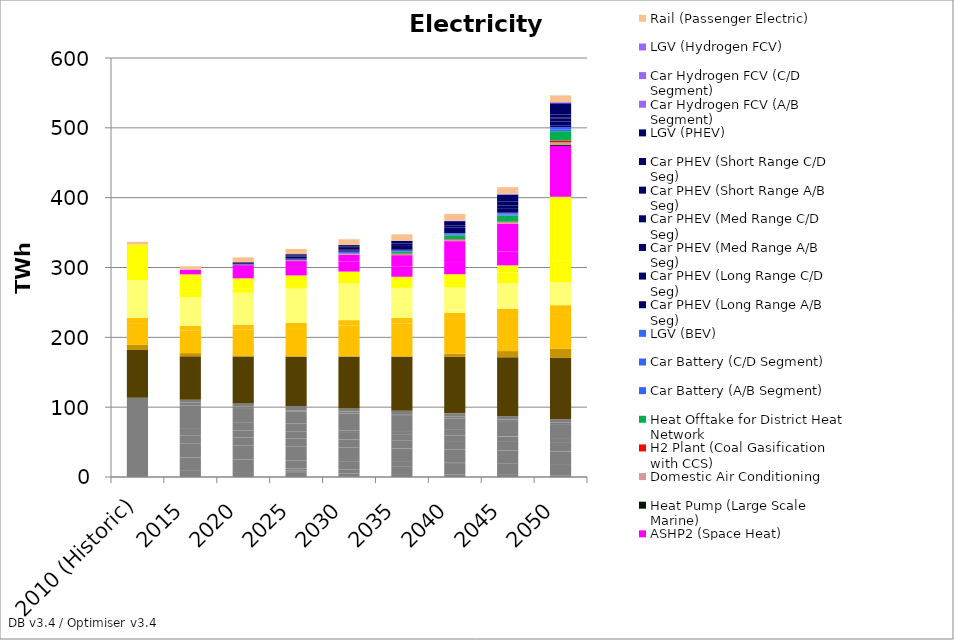
| Category | I1 Industry (Iron, Steel, Metals) | I1a Industry + CCS (Iron, Steel, Metals) | I1g Industry + hydrogen (Iron, Steel, Metals) | I2b Industry + Bio (Chemicals) | I2c Industry + Bio + CCS (Chemicals) | I2e Industry + Gas (Chemicals) | I2f Industry + Gas + CCS (Chemicals) | I2g Industry + hydrogen (Chemicals) | I3 Industry (Metal Products) | I4 Industry (Food, drinks, tobacco) | I5 Industry (Paper, printing, publishing) | I6 Industry (Other) | I6b Industry + Bio (Other) | I6c Industry + Bio + CCS (Other) | I6g Industry + hydrogen (Other) | I7b Industry + Bio (Refining) | I7c Industry + Bio + CCS (Refining) | I7e Industry + Gas (Refining) | I7f Industry + Gas + CCS (Refining) | I7g Industry + hydrogen (Refining) | I8 Industry (Agriculture) | Industry Sector | Domestic Appliances | Domestic Cooking (Electric) | Floorspace (Commercial) | Floorspace (Public) | Lighting (CFL) | Lighting (Incandescent) | Lighting (LED) | Electric Resistive Heating | Electric Resistive Heating - Hot Water | Electric Resistive Heating - Space Heat | ASHP2 (Hot Water) | ASHP2 (Space Heat) | Heat Pump (Large Scale Marine) | Domestic Air Conditioning | H2 Plant (Coal Gasification with CCS) | Heat Offtake for District Heat Network | Car Battery (A/B Segment) | Car Battery (C/D Segment) | LGV (BEV) | Car PHEV (Long Range A/B Seg) | Car PHEV (Long Range C/D Seg) | Car PHEV (Med Range A/B Seg) | Car PHEV (Med Range C/D Seg) | Car PHEV (Short Range A/B Seg) | Car PHEV (Short Range C/D Seg) | LGV (PHEV) | Car Hydrogen FCV (A/B Segment) | Car Hydrogen FCV (C/D Segment) | LGV (Hydrogen FCV) | Rail (Passenger Electric) |
|---|---|---|---|---|---|---|---|---|---|---|---|---|---|---|---|---|---|---|---|---|---|---|---|---|---|---|---|---|---|---|---|---|---|---|---|---|---|---|---|---|---|---|---|---|---|---|---|---|---|---|---|---|
| 2010 (Historic) | 0 | 0 | 0 | 0 | 0 | 0 | 0 | 0 | 0 | 0 | 0 | 0 | 0 | 0 | 0 | 0 | 0 | 0 | 0 | 0 | 0 | 113.5 | 68.4 | 7.3 | 31.2 | 7.4 | 34.3 | 19.8 | 0 | 51 | 0 | 0 | 0 | 0 | 0 | 0 | 0 | 0 | 0 | 0 | 0 | 0 | 0 | 0 | 0 | 0 | 0 | 0 | 0 | 0 | 0 | 3.9 |
| 2015 | 9.866 | 0 | 0 | 0 | 0 | 18.058 | 0 | 0 | 19.678 | 11.492 | 10.968 | 31.859 | 0 | 0 | 0 | 0.92 | 0 | 3.845 | 0 | 0 | 3.986 | 0 | 62.099 | 4.638 | 32.426 | 6.718 | 40.999 | 0 | 0.046 | 0 | 8.46 | 24.115 | 0 | 6.279 | 0 | 0.385 | 0 | 0 | 0 | 0 | 0 | 0.009 | 0.012 | 0.008 | 0.009 | 0.005 | 0.006 | 0.222 | 0 | 0 | 0 | 4.601 |
| 2020 | 7.115 | 0 | 0 | 0 | 0 | 18.134 | 0 | 0 | 19.564 | 11.559 | 10.426 | 10.786 | 19.858 | 0 | 0 | 3.494 | 0 | 0.295 | 0 | 0 | 4.111 | 0 | 66.74 | 2.061 | 37.019 | 7.058 | 45.488 | 0 | 0 | 0 | 5.899 | 14.895 | 10.462 | 8.489 | 0 | 0.574 | 0.037 | 0 | 0.213 | 0.231 | 0 | 0.534 | 1.126 | 0.008 | 0.852 | 0.005 | 0.006 | 0.648 | 0.011 | 0.012 | 0 | 6.818 |
| 2025 | 5.92 | 0 | 0 | 1.425 | 2.191 | 2.557 | 11.806 | 0 | 19.417 | 11.627 | 9.89 | 11.576 | 17.65 | 0 | 0 | 1.317 | 0 | 2.028 | 0 | 0 | 4.241 | 0 | 70.913 | 0 | 40.735 | 7.405 | 49.164 | 0 | 0 | 0 | 3.896 | 14.895 | 11.376 | 9.17 | 0 | 0.748 | 0.263 | 0 | 0.614 | 0.668 | 0 | 1.372 | 2.165 | 0.757 | 1.642 | 0.002 | 0.282 | 1.351 | 0.022 | 0.024 | 0 | 7.489 |
| 2030 | 0.728 | 4.28 | 0 | 0 | 5.974 | 0 | 11.745 | 0 | 19.301 | 11.72 | 9.341 | 3.23 | 24.489 | 0 | 0 | 0.763 | 1.994 | 0 | 0.241 | 0 | 4.389 | 0 | 74.487 | 0 | 44.17 | 7.794 | 52.607 | 0 | 0 | 0 | 2.003 | 14.895 | 14.583 | 9.567 | 0.157 | 1.056 | 0.353 | 0 | 0.959 | 1.041 | 0 | 1.054 | 1.492 | 0.753 | 1.133 | 2.905 | 0.611 | 2.289 | 0.098 | 0.105 | 0.019 | 8.132 |
| 2035 | 0 | 4.252 | 0 | 0 | 11.283 | 0 | 6.033 | 0 | 19.218 | 11.841 | 8.777 | 3.09 | 22.997 | 0 | 0 | 0 | 2.484 | 0 | 0.22 | 0 | 4.556 | 0 | 77.644 | 0 | 47.216 | 8.231 | 23.076 | 0 | 19.644 | 0 | 1.261 | 14.895 | 14.835 | 16.119 | 0.023 | 1.346 | 0.71 | 2.403 | 0.934 | 1.013 | 0 | 0.337 | 0.419 | 0.301 | 0.318 | 6.614 | 2.275 | 3.763 | 0.182 | 0.197 | 0.037 | 8.911 |
| 2040 | 0 | 3.603 | 0 | 0 | 16.336 | 0 | 0.386 | 0 | 19.165 | 11.992 | 8.197 | 0 | 0 | 8.882 | 15.409 | 0 | 2.246 | 0 | 0.2 | 0 | 4.747 | 0 | 80.864 | 4.671 | 49.748 | 8.722 | 4.878 | 0 | 31.413 | 0 | 0 | 18.944 | 16.216 | 31.142 | 0.036 | 1.926 | 0.71 | 5.708 | 1.281 | 1.389 | 0.268 | 0 | 0 | 0 | 0 | 8.382 | 2.806 | 6.157 | 0.327 | 0.355 | 0.068 | 9.627 |
| 2045 | 0 | 0 | 3.034 | 0 | 0 | 0 | 0 | 15.88 | 19.142 | 12.179 | 7.601 | 0 | 0 | 0.511 | 21.769 | 0 | 2.034 | 0 | 0 | 0.183 | 4.965 | 0 | 84.148 | 8.852 | 51.612 | 9.274 | 6.147 | 0 | 30.463 | 0 | 14.849 | 10.425 | 19.929 | 39.474 | 0.07 | 2.42 | 0.688 | 8.766 | 1.603 | 1.736 | 0.701 | 0 | 0 | 5.55 | 0 | 4.995 | 5.276 | 10.012 | 0.512 | 0.558 | 0.104 | 9.559 |
| 2050 | 0 | 0 | 2.529 | 0 | 0 | 0 | 0 | 14.719 | 19.144 | 12.404 | 6.987 | 0 | 0 | 0 | 19.992 | 0 | 0 | 0 | 0 | 2.008 | 5.213 | 0 | 87.496 | 13.032 | 52.632 | 9.894 | 0.139 | 0 | 32.895 | 0 | 30.691 | 91.509 | 22.569 | 50.299 | 1.68 | 3.449 | 2.41 | 13.455 | 2.214 | 2.395 | 1.397 | 2.397 | 0 | 5.55 | 4.517 | 1.404 | 4.038 | 16.167 | 0.928 | 0.714 | 0.177 | 9.392 |